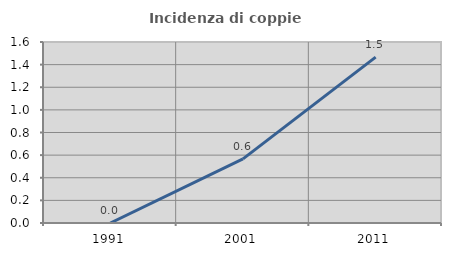
| Category | Incidenza di coppie miste |
|---|---|
| 1991.0 | 0 |
| 2001.0 | 0.567 |
| 2011.0 | 1.466 |